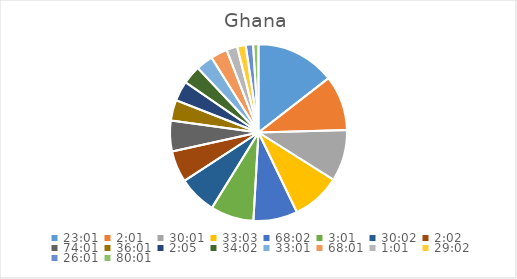
| Category | Series 0 |
|---|---|
| 0.9590277777777777 | 15.366 |
| 0.08402777777777777 | 10.68 |
| 1.2506944444444443 | 9.963 |
| 1.3770833333333332 | 9.436 |
| 2.834722222222222 | 8.557 |
| 0.12569444444444444 | 8.362 |
| 1.2513888888888889 | 7.413 |
| 0.08472222222222221 | 6.105 |
| 3.0840277777777776 | 5.952 |
| 1.5006944444444443 | 4.005 |
| 0.08680555555555557 | 3.875 |
| 1.4180555555555554 | 3.582 |
| 1.3756944444444443 | 3.291 |
| 2.8340277777777776 | 3.227 |
| 0.042361111111111106 | 2.113 |
| 1.2097222222222224 | 1.658 |
| 1.0840277777777778 | 1.424 |
| 3.3340277777777776 | 1.038 |